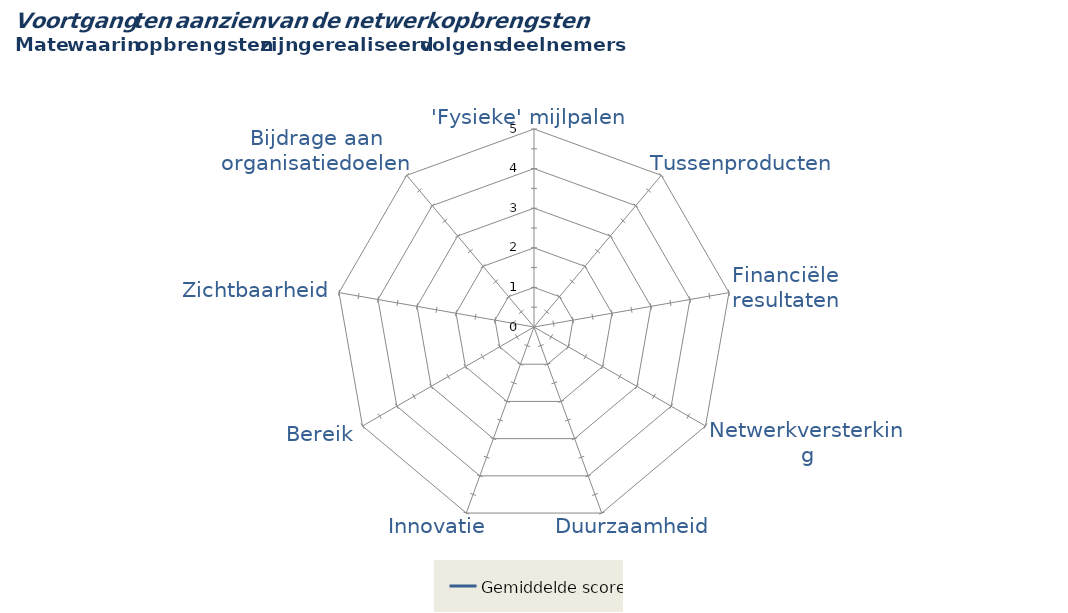
| Category | Gemiddelde score |
|---|---|
| 'Fysieke' mijlpalen | 0 |
| Tussenproducten | 0 |
| Financiële resultaten | 0 |
| Netwerkversterking | 0 |
| Duurzaamheid | 0 |
| Innovatie | 0 |
| Bereik | 0 |
| Zichtbaarheid | 0 |
| Bijdrage aan organisatiedoelen | 0 |